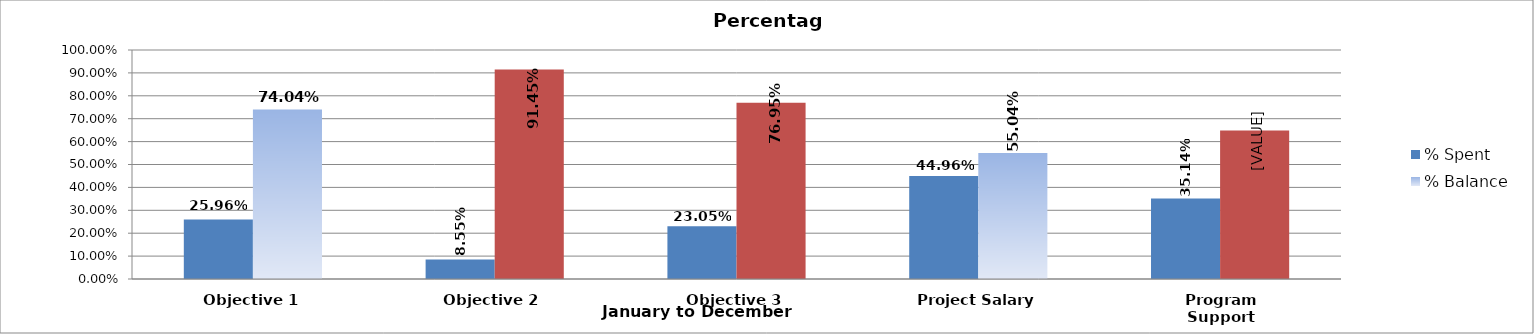
| Category |  % Spent   |  % Balance   |
|---|---|---|
| Objective 1 | 0.26 | 0.74 |
| Objective 2  | 0.086 | 0.914 |
| Objective 3 | 0.231 | 0.769 |
| Project Salary | 0.45 | 0.55 |
| Program Support | 0.351 | 0.649 |